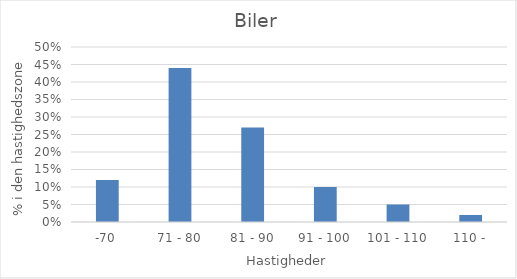
| Category | Biler |
|---|---|
| -70 | 0.12 |
| 71 - 80 | 0.44 |
| 81 - 90 | 0.27 |
| 91 - 100 | 0.1 |
| 101 - 110 | 0.05 |
| 110 - | 0.02 |